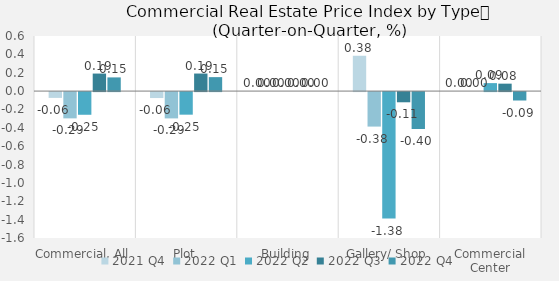
| Category | 2021 | 2022 |
|---|---|---|
| Commercial, All | -0.063 | 0.149 |
| Plot | -0.065 | 0.152 |
| Building | 0 | 0 |
| Gallery/ Shop | 0.385 | -0.402 |
| Commercial Center | 0 | -0.092 |